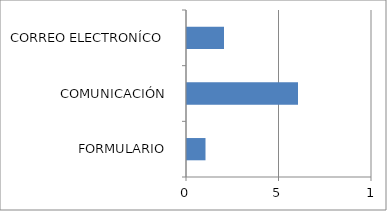
| Category | Series 0 |
|---|---|
| FORMULARIO  | 1 |
| COMUNICACIÓN  | 6 |
| CORREO ELECTRONÍCO  | 2 |